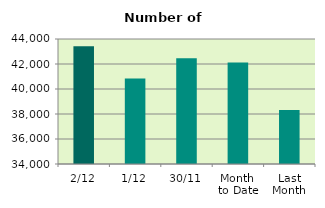
| Category | Series 0 |
|---|---|
| 2/12 | 43414 |
| 1/12 | 40834 |
| 30/11 | 42460 |
| Month 
to Date | 42124 |
| Last
Month | 38326.182 |